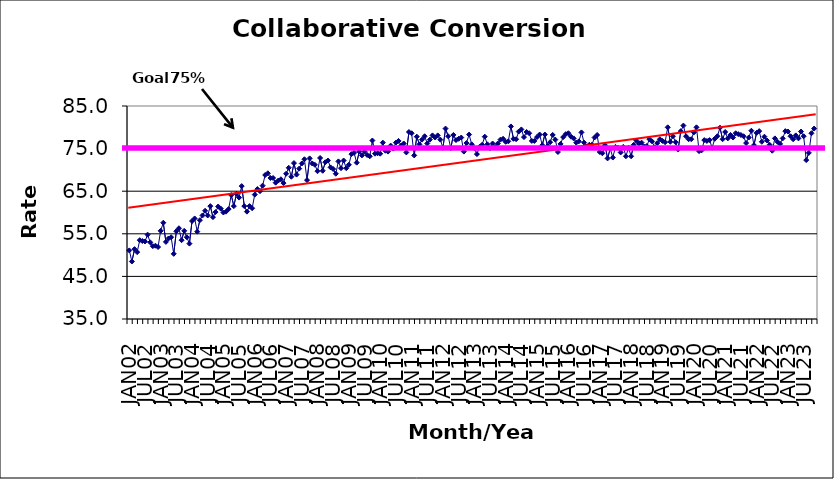
| Category | Series 0 |
|---|---|
| JAN02 | 51.1 |
| FEB02 | 48.5 |
| MAR02 | 51.4 |
| APR02 | 50.7 |
| MAY02 | 53.5 |
| JUN02 | 53.3 |
| JUL02 | 53.2 |
| AUG02 | 54.8 |
| SEP02 | 53 |
| OCT02 | 52.1 |
| NOV02 | 52.2 |
| DEC02 | 51.9 |
| JAN03 | 55.7 |
| FEB03 | 57.6 |
| MAR03 | 53.1 |
| APR03 | 53.9 |
| MAY03 | 54.2 |
| JUN03 | 50.3 |
| JUL03 | 55.6 |
| AUG03 | 56.3 |
| SEP03 | 53.5 |
| OCT03 | 55.7 |
| NOV03 | 54.2 |
| DEC03 | 52.7 |
| JAN04 | 58 |
| FEB04 | 58.6 |
| MAR04 | 55.5 |
| APR04 | 58.2 |
| MAY04 | 59.3 |
| JUN04 | 60.4 |
| JUL04 | 59.3 |
| AUG04 | 61.5 |
| SEP04 | 58.9 |
| OCT04 | 60.1 |
| NOV04 | 61.4 |
| DEC04 | 60.9 |
| JAN05 | 60 |
| FEB05 | 60.2 |
| MAR05 | 60.8 |
| APR05 | 64.1 |
| MAY05 | 61.5 |
| JUN05 | 64.4 |
| JUL05 | 63.5 |
| AUG05 | 66.2 |
| SEP05 | 61.5 |
| OCT05 | 60.2 |
| NOV05 | 61.5 |
| DEC05 | 61 |
| JAN06 | 64.2 |
| FEB06 | 65.5 |
| MAR06 | 65 |
| APR06 | 66.3 |
| MAY06 | 68.8 |
| JUN06 | 69.2 |
| JUL06 | 68.1 |
| AUG06 | 68.1 |
| SEP06 | 67 |
| OCT06 | 67.5 |
| NOV06 | 67.8 |
| DEC06 | 66.9 |
| JAN07 | 69.1 |
| FEB07 | 70.5 |
| MAR07 | 68.4 |
| APR07 | 71.6 |
| MAY07 | 68.9 |
| JUN07 | 70.3 |
| JUL07 | 71.5 |
| AUG07 | 72.5 |
| SEP07 | 67.6 |
| OCT07 | 72.7 |
| NOV07 | 71.5 |
| DEC07 | 71.2 |
| JAN08 | 69.7 |
| FEB08 | 72.8 |
| MAR08 | 69.8 |
| APR08 | 71.8 |
| MAY08 | 72.2 |
| JUN08 | 70.6 |
| JUL08 | 70.2 |
| AUG08 | 69.1 |
| SEP08 | 72 |
| OCT08 | 70.4 |
| NOV08 | 72.2 |
| DEC08 | 70.4 |
| JAN09 | 71.2 |
| FEB09 | 73.7 |
| MAR09 | 74 |
| APR09 | 71.7 |
| MAY09 | 74.3 |
| JUN09 | 73.4 |
| JUL09 | 74.3 |
| AUG09 | 73.5 |
| SEP09 | 73.2 |
| OCT09 | 76.9 |
| NOV09 | 73.8 |
| DEC09 | 73.9 |
| JAN10 | 73.8 |
| FEB10 | 76.4 |
| MAR10 | 74.5 |
| APR10 | 74.3 |
| MAY10 | 75.7 |
| JUN10 | 75 |
| JUL10 | 76.4 |
| AUG10 | 76.8 |
| SEP10 | 75.7 |
| OCT10 | 76.2 |
| NOV10 | 74.1 |
| DEC10 | 78.9 |
| JAN11 | 78.6 |
| FEB11 | 73.4 |
| MAR11 | 77.8 |
| APR11 | 76 |
| MAY11 | 77.1 |
| JUN11 | 77.9 |
| JUL11 | 76.2 |
| AUG11 | 77.1 |
| SEP11 | 78.1 |
| OCT11 | 77.6 |
| NOV11 | 78.1 |
| DEC11 | 77.1 |
| JAN12 | 75.2 |
| FEB12 | 79.7 |
| MAR12 | 77.9 |
| APR12 | 75.1 |
| MAY12 | 78.2 |
| JUN12 | 77 |
| JUL12 | 77.3 |
| AUG12 | 77.6 |
| SEP12 | 74.3 |
| OCT12 | 76.3 |
| NOV12 | 78.3 |
| DEC12 | 76 |
| JAN13 | 75.1 |
| FEB13 | 73.7 |
| MAR13 | 75.4 |
| APR13 | 75.9 |
| MAY13 | 77.8 |
| JUN13 | 76 |
| JUL13 | 75.1 |
| AUG13 | 76.2 |
| SEP13 | 75.4 |
| OCT13 | 76.2 |
| NOV13 | 77.1 |
| DEC13 | 77.3 |
| JAN14 | 76.6 |
| FEB14 | 76.7 |
| MAR14 | 80.2 |
| APR14 | 77.3 |
| MAY14 | 77.2 |
| JUN14 | 79 |
| JUL14 | 79.5 |
| AUG14 | 77.7 |
| SEP14 | 78.9 |
| OCT14 | 78.6 |
| NOV14 | 76.8 |
| DEC14 | 76.8 |
| JAN15 | 77.7 |
| FEB15 | 78.3 |
| MAR15 | 75.8 |
| APR15 | 78.3 |
| MAY15 | 75.6 |
| JUN15 | 76.5 |
| JUL15 | 78.2 |
| AUG15 | 77.1 |
| SEP15 | 74.2 |
| OCT15 | 76.1 |
| NOV15 | 77.7 |
| DEC15 | 78.4 |
| JAN16 | 78.6 |
| FEB16 | 77.8 |
| MAR16 | 77.4 |
| APR16 | 76.4 |
| MAY16 | 76.7 |
| JUN16 | 78.8 |
| JUL16 | 76.4 |
| AUG16 | 75.5 |
| SEP16 | 75.9 |
| OCT16 | 75.9 |
| NOV16 | 77.6 |
| DEC16 | 78.2 |
| JAN17 | 74.2 |
| FEB17 | 73.9 |
| MAR17 | 75.8 |
| APR17 | 72.7 |
| MAY17 | 75 |
| JUN17 | 72.9 |
| JUL17 | 75.4 |
| AUG17 | 75.2 |
| SEP17 | 74.1 |
| OCT17 | 75.4 |
| NOV17 | 73.2 |
| DEC17 | 75.2 |
| JAN18 | 73.2 |
| FEB18 | 75.9 |
| MAR18 | 76.9 |
| APR18 | 76.2 |
| MAY18 | 76.4 |
| JUN18 | 75.5 |
| JUL18 | 75.6 |
| AUG18 | 77.2 |
| SEP18 | 76.7 |
| OCT18 | 75.3 |
| NOV18 | 76.3 |
| DEC18 | 77.2 |
| JAN19 | 76.8 |
| FEB19 | 76.5 |
| MAR19 | 80 |
| APR19 | 76.6 |
| MAY19 | 77.9 |
| JUN19 | 76.5 |
| JUL19 | 74.8 |
| AUG19 | 79.1 |
| SEP19 | 80.4 |
| OCT19 | 77.9 |
| NOV19 | 77.2 |
| DEC19 | 77.2 |
| JAN20 | 78.8 |
| FEB20 | 80 |
| MAR20 | 74.4 |
| APR20 | 74.6 |
| MAY20 | 77 |
| JUN20 | 76.8 |
| JUL20 | 77 |
| AUG20 | 75.2 |
| SEP20 | 77.3 |
| OCT20 | 77.9 |
| NOV20 | 79.9 |
| DEC20 | 77.2 |
| JAN21 | 78.9 |
| FEB21 | 77.4 |
| MAR21 | 78.2 |
| APR21 | 77.6 |
| MAY21 | 78.6 |
| JUN21 | 78.4 |
| JUL21 | 78.2 |
| AUG21 | 77.9 |
| SEP21 | 76.3 |
| OCT21 | 77.6 |
| NOV21 | 79.2 |
| DEC21 | 75.8 |
| JAN22 | 78.7 |
| FEB22 | 79.1 |
| MAR22 | 76.6 |
| APR22 | 77.8 |
| MAY22 | 76.9 |
| JUN22 | 75.9 |
| JUL22 | 74.5 |
| AUG22 | 77.4 |
| SEP22 | 76.6 |
| OCT22 | 76.1 |
| NOV22 | 77.4 |
| DEC22 | 79.1 |
| JAN23 | 79 |
| FEB23 | 77.9 |
| MAR23 | 77.2 |
| APR23 | 78.1 |
| MAY23 | 77.4 |
| JUN23 | 79 |
| JUL23 | 77.9 |
| AUG23 | 72.3 |
| SEP23 | 74 |
| OCT23 | 78.6 |
| NOV23 | 79.7 |